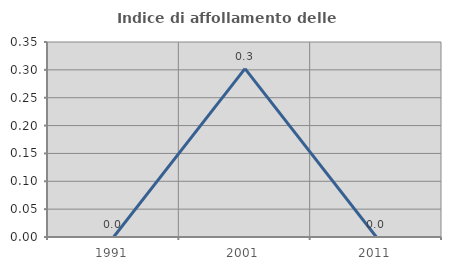
| Category | Indice di affollamento delle abitazioni  |
|---|---|
| 1991.0 | 0 |
| 2001.0 | 0.302 |
| 2011.0 | 0 |